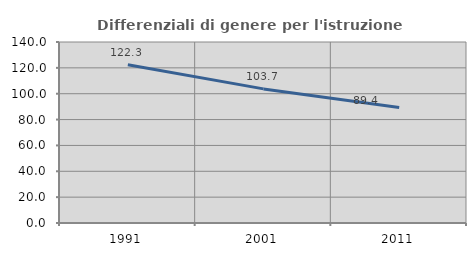
| Category | Differenziali di genere per l'istruzione superiore |
|---|---|
| 1991.0 | 122.328 |
| 2001.0 | 103.727 |
| 2011.0 | 89.357 |